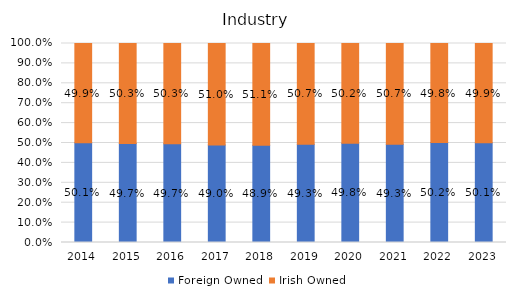
| Category | Foreign Owned | Irish Owned |
|---|---|---|
| 2014.0 | 0.501 | 0.499 |
| 2015.0 | 0.497 | 0.503 |
| 2016.0 | 0.497 | 0.503 |
| 2017.0 | 0.49 | 0.51 |
| 2018.0 | 0.489 | 0.511 |
| 2019.0 | 0.493 | 0.507 |
| 2020.0 | 0.498 | 0.502 |
| 2021.0 | 0.493 | 0.507 |
| 2022.0 | 0.502 | 0.498 |
| 2023.0 | 0.501 | 0.499 |